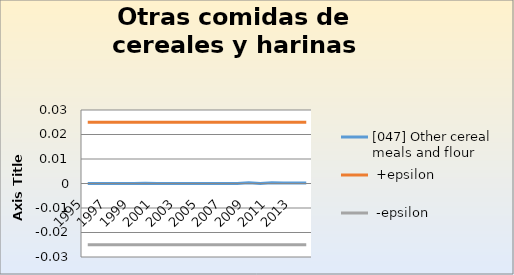
| Category | [047] Other cereal meals and flour |  +epsilon |  -epsilon |
|---|---|---|---|
| 1995.0 | 0 | 0.025 | -0.025 |
| 1996.0 | 0 | 0.025 | -0.025 |
| 1997.0 | 0 | 0.025 | -0.025 |
| 1998.0 | 0 | 0.025 | -0.025 |
| 1999.0 | 0 | 0.025 | -0.025 |
| 2000.0 | 0 | 0.025 | -0.025 |
| 2001.0 | 0 | 0.025 | -0.025 |
| 2002.0 | 0 | 0.025 | -0.025 |
| 2003.0 | 0 | 0.025 | -0.025 |
| 2004.0 | 0 | 0.025 | -0.025 |
| 2005.0 | 0 | 0.025 | -0.025 |
| 2006.0 | 0 | 0.025 | -0.025 |
| 2007.0 | 0 | 0.025 | -0.025 |
| 2008.0 | 0 | 0.025 | -0.025 |
| 2009.0 | 0 | 0.025 | -0.025 |
| 2010.0 | 0 | 0.025 | -0.025 |
| 2011.0 | 0 | 0.025 | -0.025 |
| 2012.0 | 0 | 0.025 | -0.025 |
| 2013.0 | 0 | 0.025 | -0.025 |
| 2014.0 | 0 | 0.025 | -0.025 |